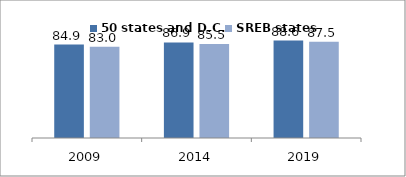
| Category | 50 states and D.C. | SREB states |
|---|---|---|
| 2009.0 | 84.927 | 82.965 |
| 2014.0 | 86.903 | 85.509 |
| 2019.0 | 88.609 | 87.455 |